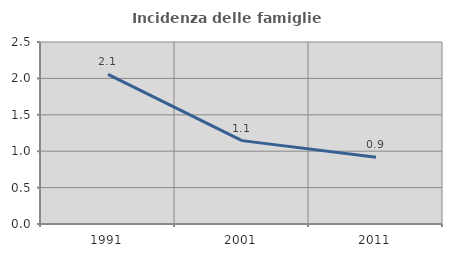
| Category | Incidenza delle famiglie numerose |
|---|---|
| 1991.0 | 2.056 |
| 2001.0 | 1.145 |
| 2011.0 | 0.917 |